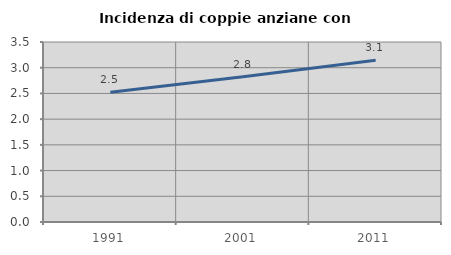
| Category | Incidenza di coppie anziane con figli |
|---|---|
| 1991.0 | 2.522 |
| 2001.0 | 2.826 |
| 2011.0 | 3.147 |